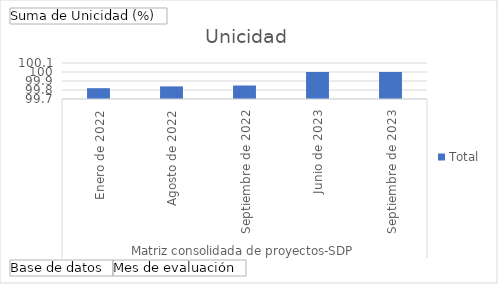
| Category | Total |
|---|---|
| 0 | 99.82 |
| 1 | 99.84 |
| 2 | 99.85 |
| 3 | 100 |
| 4 | 100 |